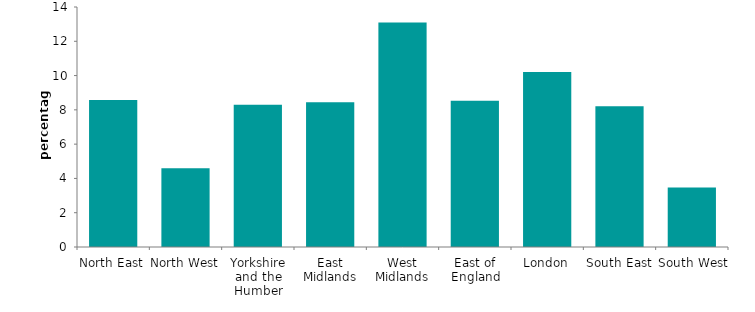
| Category | social renters |
|---|---|
| North East | 8.57 |
| North West | 4.587 |
| Yorkshire and the Humber | 8.293 |
| East Midlands | 8.451 |
| West Midlands | 13.093 |
| East of England | 8.534 |
| London | 10.212 |
| South East | 8.213 |
| South West | 3.476 |